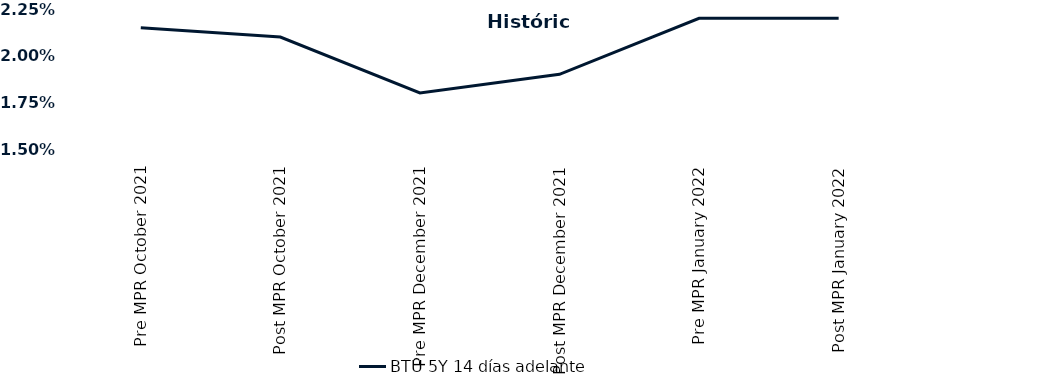
| Category | BTU 5Y 14 días adelante |
|---|---|
| Pre MPR October 2021 | 0.022 |
| Post MPR October 2021 | 0.021 |
| Pre MPR December 2021 | 0.018 |
| Post MPR December 2021 | 0.019 |
| Pre MPR January 2022 | 0.022 |
| Post MPR January 2022 | 0.022 |